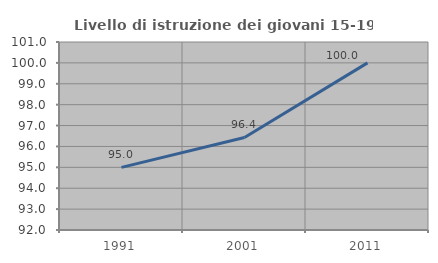
| Category | Livello di istruzione dei giovani 15-19 anni |
|---|---|
| 1991.0 | 95 |
| 2001.0 | 96.429 |
| 2011.0 | 100 |